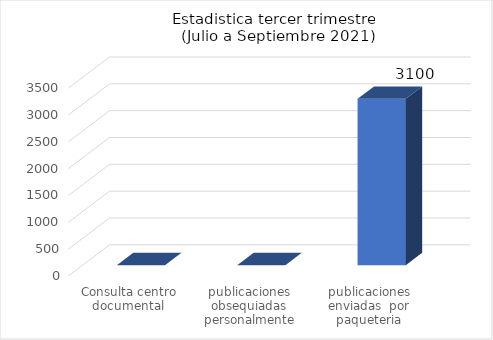
| Category | Abril a Junio |
|---|---|
| Consulta centro documental | 0 |
| publicaciones obsequiadas personalmente | 0 |
| publicaciones enviadas  por paqueteria | 3100 |